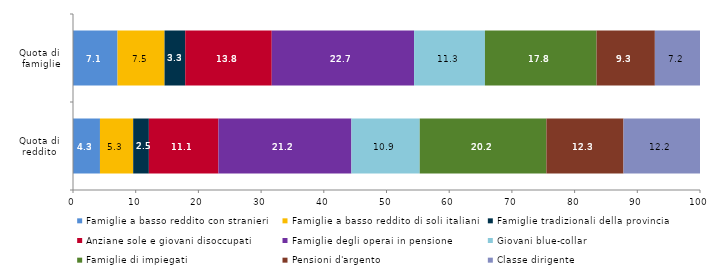
| Category | Famiglie a basso reddito con stranieri | Famiglie a basso reddito di soli italiani | Famiglie tradizionali della provincia | Anziane sole e giovani disoccupati | Famiglie degli operai in pensione | Giovani blue-collar | Famiglie di impiegati | Pensioni d'argento | Classe dirigente |
|---|---|---|---|---|---|---|---|---|---|
| Quota di 
reddito  | 4.3 | 5.3 | 2.5 | 11.1 | 21.2 | 10.9 | 20.2 | 12.3 | 12.2 |
| Quota di 
famiglie | 7.1 | 7.5 | 3.3 | 13.8 | 22.7 | 11.3 | 17.8 | 9.3 | 7.2 |